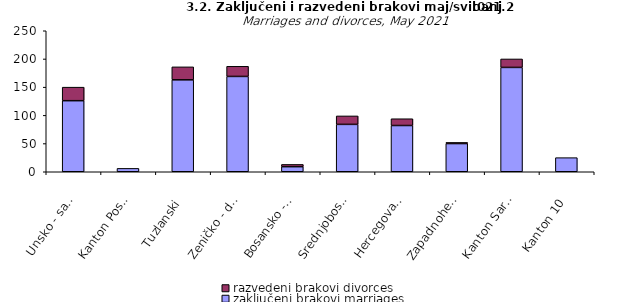
| Category | zaključeni brakovi marriages | razvedeni brakovi divorces |
|---|---|---|
| Unsko - sanski | 126 | 24 |
| Kanton Posavski | 6 | 0 |
| Tuzlanski | 163 | 23 |
| Zeničko - dobojski | 169 | 18 |
| Bosansko - podrinjski | 9 | 4 |
| Srednjobosanski | 84 | 15 |
| Hercegovačko-neretvanski | 82 | 12 |
| Zapadnohercegovački | 50 | 2 |
| Kanton Sarajevo | 185 | 15 |
| Kanton 10 | 25 | 0 |